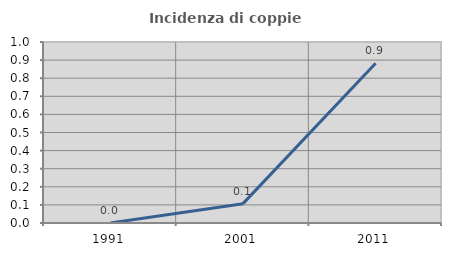
| Category | Incidenza di coppie miste |
|---|---|
| 1991.0 | 0 |
| 2001.0 | 0.107 |
| 2011.0 | 0.883 |